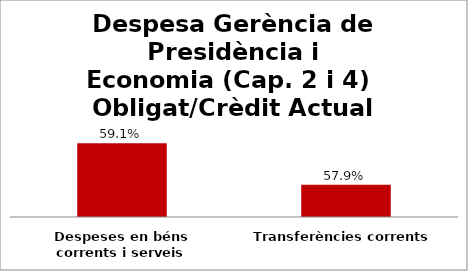
| Category | Series 0 |
|---|---|
| Despeses en béns corrents i serveis | 0.591 |
| Transferències corrents | 0.579 |